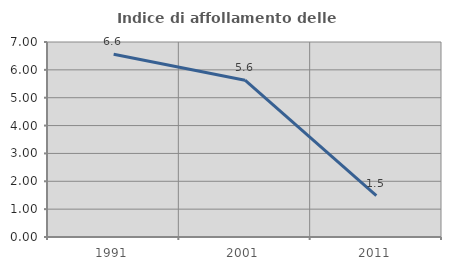
| Category | Indice di affollamento delle abitazioni  |
|---|---|
| 1991.0 | 6.557 |
| 2001.0 | 5.628 |
| 2011.0 | 1.485 |